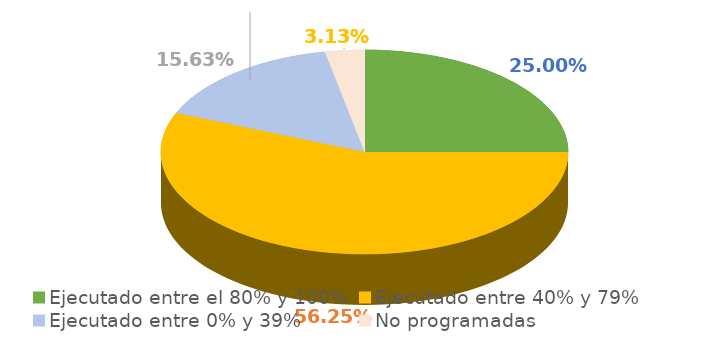
| Category | Series 0 |
|---|---|
| Ejecutado entre el 80% y 100% | 0.25 |
| Ejecutado entre 40% y 79% | 0.562 |
| Ejecutado entre 0% y 39% | 0.156 |
| No programadas | 0.031 |